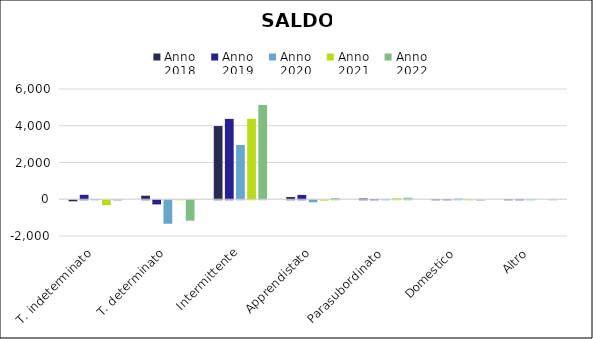
| Category | Anno
2018 | Anno
2019 | Anno
2020 | Anno
2021 | Anno
2022 |
|---|---|---|---|---|---|
| T. indeterminato | -59 | 241 | 12 | -266 | -15 |
| T. determinato | 193 | -227 | -1279 | 1 | -1110 |
| Intermittente | 3983 | 4373 | 2953 | 4378 | 5123 |
| Apprendistato | 121 | 235 | -111 | -23 | 60 |
| Parasubordinato | 42 | 13 | 11 | 50 | 82 |
| Domestico | 6 | 6 | 32 | -4 | -14 |
| Altro | 4 | 2 | 1 | 0 | 2 |